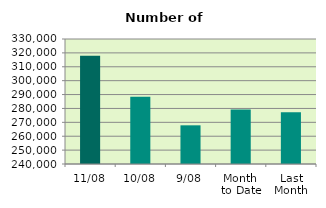
| Category | Series 0 |
|---|---|
| 11/08 | 318028 |
| 10/08 | 288492 |
| 9/08 | 267846 |
| Month 
to Date | 279249.333 |
| Last
Month | 277312.476 |